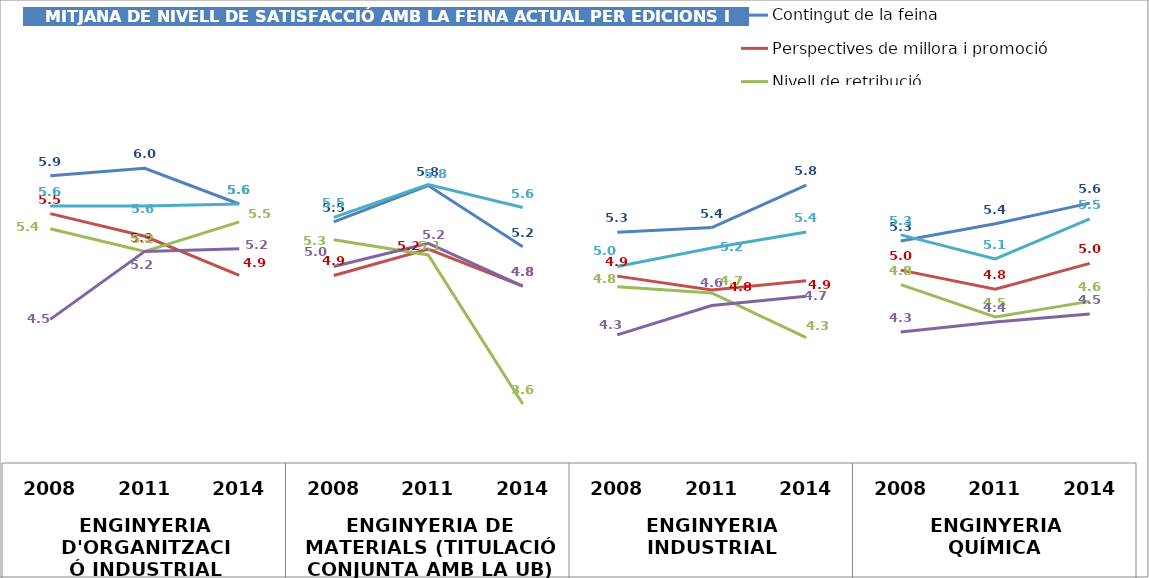
| Category | Contingut de la feina | Perspectives de millora i promoció | Nivell de retribució | Utilitat dels coneixements de la formació universitària | Satisfacció general amb la feina * |
|---|---|---|---|---|---|
| 0 | 5.923 | 5.538 | 5.385 | 4.462 | 5.615 |
| 1 | 6 | 5.308 | 5.154 | 5.154 | 5.615 |
| 2 | 5.636 | 4.909 | 5.455 | 5.182 | 5.636 |
| 3 | 5.455 | 4.909 | 5.273 | 5 | 5.5 |
| 4 | 5.824 | 5.176 | 5.118 | 5.235 | 5.833 |
| 5 | 5.2 | 4.8 | 3.6 | 4.8 | 5.6 |
| 6 | 5.348 | 4.902 | 4.793 | 4.304 | 5 |
| 7 | 5.397 | 4.762 | 4.73 | 4.603 | 5.187 |
| 8 | 5.829 | 4.855 | 4.276 | 4.697 | 5.351 |
| 9 | 5.259 | 4.963 | 4.815 | 4.333 | 5.321 |
| 10 | 5.436 | 4.769 | 4.487 | 4.436 | 5.077 |
| 11 | 5.645 | 5.032 | 4.645 | 4.516 | 5.485 |